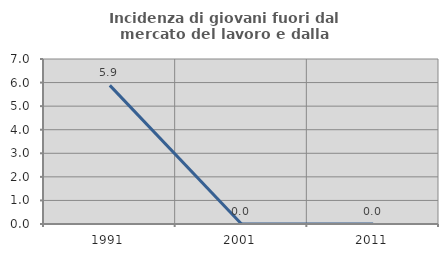
| Category | Incidenza di giovani fuori dal mercato del lavoro e dalla formazione  |
|---|---|
| 1991.0 | 5.882 |
| 2001.0 | 0 |
| 2011.0 | 0 |